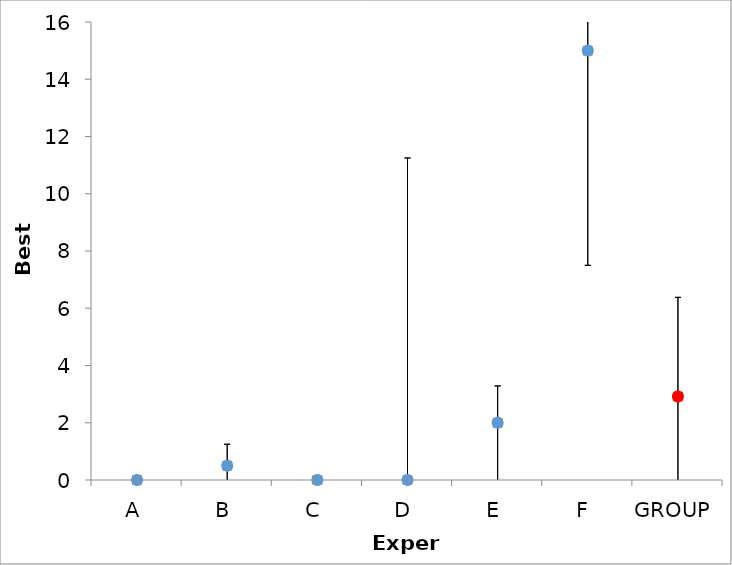
| Category | Series 1 | Series 0 |
|---|---|---|
| A | 0 | 0 |
| B | 0.5 | 0.5 |
| C | 0 | 0 |
| D | 0 | 0 |
| E | 2 | 2 |
| F | 15 | 15 |
| GROUP | 2.917 | 2.917 |